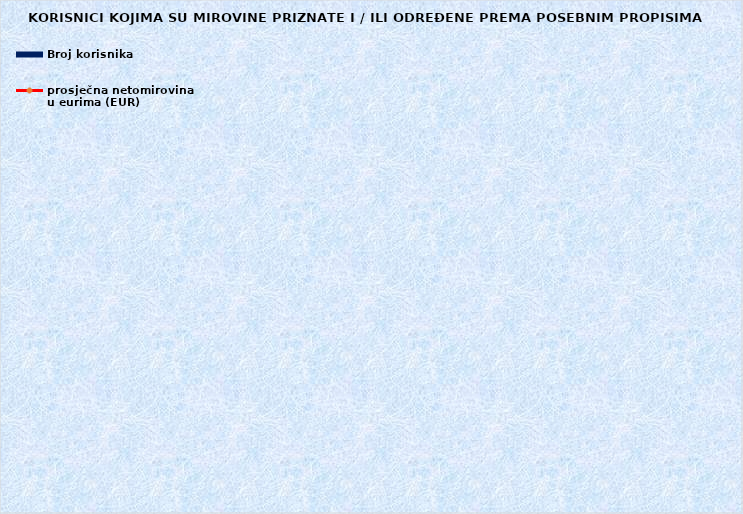
| Category | Broj korisnika |
|---|---|
|      a) radnici na poslovima ovlaštenih službenih osoba u tijelima unutarnjih 
poslova i pravosuđa, kojima je pravo na mirovinu priznato prema propisima
koji su bili na snazi do stupanja na snagu Zakona o pravima iz mirovinskog
osiguranja DVO, PS i OSO | 6989 |
|      b) radnici na  poslovima policijskih službenika, ovlaštenih službenih osoba pravosuđa i službene osobe s posebnim dužnostima i ovlastima u sigurnosno obavještajnom sustavu RH koji su pravo na mirovinu ostvarili prema Zakonu o pravima DVO, PS i OSO | 9523 |
|      c) radnici na poslovima razminiranja | 671 |
| Korisnici koji pravo na mirovinu ostvaruju prema Zakonu o vatrogastvu (NN 125/19)* | 357 |
| Djelatne vojne osobe - DVO  | 16043 |
| Pripadnici Hrvatske domovinske vojske od 1941. do 1945. godine | 1862 |
| Bivši politički zatvorenici | 2057 |
| Hrvatski branitelji iz Domovinskog rata - ZOHBDR | 71271 |
| Mirovine priznate prema općim propisima, a određene prema
ZOHBDR - u iz 2017. (čl. 27., 35., 48. i 49. stavak 2.)  | 57742 |
| Pripadnici bivše Jugoslavenske narodne armije - JNA | 3610 |
| Pripadnici bivše Jugoslavenske narodne armije - JNA - čl. 185 ZOMO | 156 |
| Sudionici Narodnooslobodilačkog rata - NOR | 4850 |
| Zastupnici u Hrvatskom saboru, članovi Vlade, suci Ustavnog suda i glavni državni revizor  | 679 |
| Članovi Izvršnog vijeća Sabora, Saveznog izvršnog vijeća i administrativno umirovljeni javni službenici | 64 |
| Bivši službenici u saveznim tijelima bivše SFRJ - članak 38. ZOMO | 17 |
| Redoviti članovi Hrvatske akademije znanosti i umjetnosti - HAZU | 124 |
| Radnici u Istarskim ugljenokopima "Tupljak" d.d. Labin  | 245 |
| Radnici profesionalno izloženi azbestu | 816 |
| Osiguranici - članovi posade broda u međunarodnoj plovidbi i nacionalnoj plovidbi - članak 129. a stavak 2. Pomorskog zakonika | 204 |
| Pripadnici Hrvatskog vijeća obrane  - HVO  | 6729 |